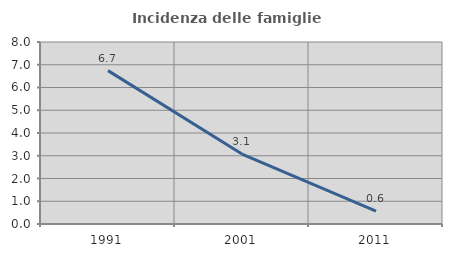
| Category | Incidenza delle famiglie numerose |
|---|---|
| 1991.0 | 6.742 |
| 2001.0 | 3.074 |
| 2011.0 | 0.569 |